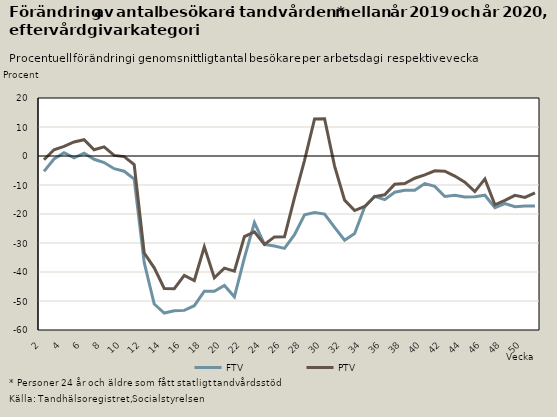
| Category | FTV | PTV |
|---|---|---|
| 2.0 | -5.284 | -1.274 |
| 3.0 | -1.022 | 2.145 |
| 4.0 | 1.122 | 3.303 |
| 5.0 | -0.64 | 4.836 |
| 6.0 | 0.964 | 5.6 |
| 7.0 | -1.131 | 2.137 |
| 8.0 | -2.247 | 3.143 |
| 9.0 | -4.381 | 0.208 |
| 10.0 | -5.249 | -0.214 |
| 11.0 | -7.975 | -2.974 |
| 12.0 | -36.755 | -33.463 |
| 13.0 | -51.033 | -38.558 |
| 14.0 | -54.136 | -45.668 |
| 15.0 | -53.365 | -45.743 |
| 16.0 | -53.233 | -41.195 |
| 17.0 | -51.621 | -42.937 |
| 18.0 | -46.618 | -31.344 |
| 19.0 | -46.628 | -42.018 |
| 20.0 | -44.657 | -38.684 |
| 21.0 | -48.549 | -39.723 |
| 22.0 | -35.158 | -27.815 |
| 23.0 | -22.962 | -26.153 |
| 24.0 | -30.478 | -30.519 |
| 25.0 | -31.067 | -27.898 |
| 26.0 | -31.862 | -27.87 |
| 27.0 | -27.105 | -14.326 |
| 28.0 | -20.291 | -1.494 |
| 29.0 | -19.509 | 12.776 |
| 30.0 | -20.02 | 12.826 |
| 31.0 | -24.637 | -3.48 |
| 32.0 | -29.013 | -15.22 |
| 33.0 | -26.726 | -18.812 |
| 34.0 | -17.582 | -17.415 |
| 35.0 | -13.895 | -13.982 |
| 36.0 | -15.036 | -13.393 |
| 37.0 | -12.478 | -9.743 |
| 38.0 | -11.82 | -9.502 |
| 39.0 | -11.777 | -7.66 |
| 40.0 | -9.511 | -6.524 |
| 41.0 | -10.464 | -5.119 |
| 42.0 | -13.97 | -5.217 |
| 43.0 | -13.544 | -6.918 |
| 44.0 | -14.142 | -9.019 |
| 45.0 | -14.011 | -12.273 |
| 46.0 | -13.521 | -7.891 |
| 47.0 | -17.824 | -16.824 |
| 48.0 | -16.39 | -15.287 |
| 49.0 | -17.481 | -13.576 |
| 50.0 | -17.264 | -14.293 |
| 51.0 | -17.246 | -12.683 |